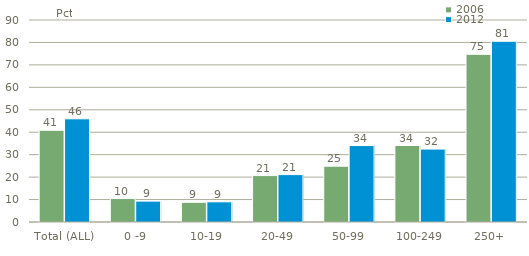
| Category | 2006 | 2012 |
|---|---|---|
| Total (ALL) | 40.877 | 45.978 |
| 0 -9 | 10.447 | 9.316 |
| 10-19 | 8.784 | 8.998 |
| 20-49 | 20.678 | 21.112 |
| 50-99 | 24.862 | 34.054 |
| 100-249 | 34.079 | 32.487 |
| 250+ | 74.713 | 80.537 |